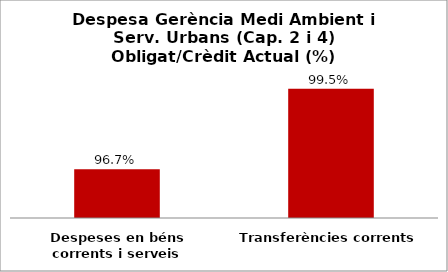
| Category | Series 0 |
|---|---|
| Despeses en béns corrents i serveis | 0.967 |
| Transferències corrents | 0.995 |